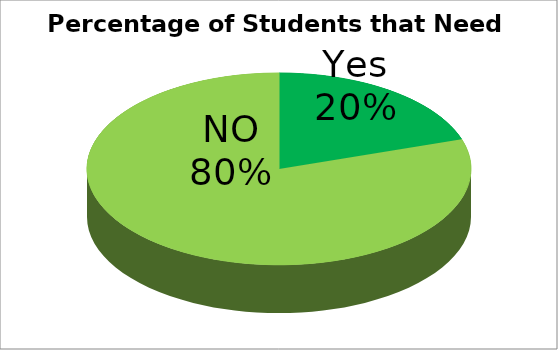
| Category | Series 0 |
|---|---|
| Yes | 2 |
| No | 8 |